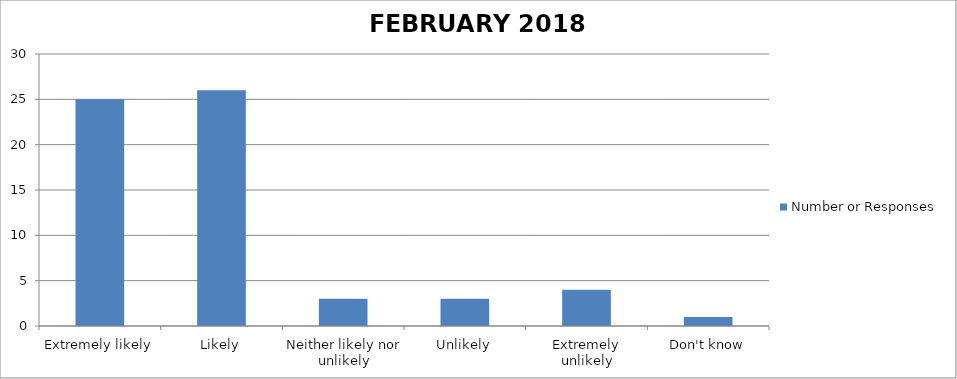
| Category | Number or Responses |
|---|---|
| Extremely likely | 25 |
| Likely | 26 |
| Neither likely nor unlikely | 3 |
| Unlikely | 3 |
| Extremely unlikely | 4 |
| Don't know | 1 |